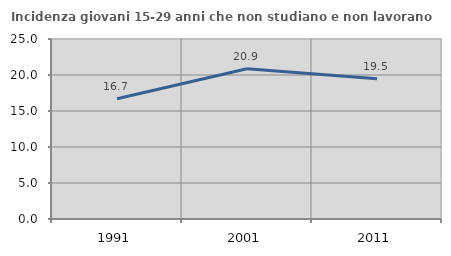
| Category | Incidenza giovani 15-29 anni che non studiano e non lavorano  |
|---|---|
| 1991.0 | 16.701 |
| 2001.0 | 20.874 |
| 2011.0 | 19.492 |